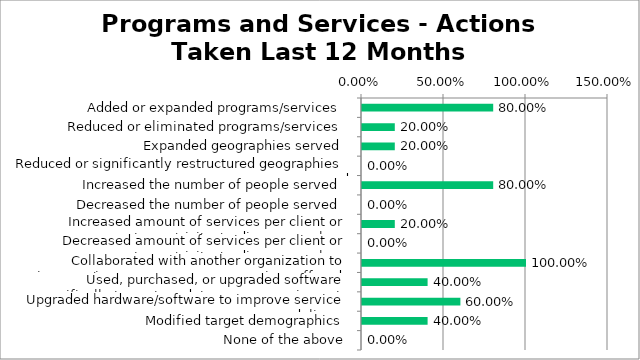
| Category | Responses |
|---|---|
| Added or expanded programs/services | 0.8 |
| Reduced or eliminated programs/services | 0.2 |
| Expanded geographies served | 0.2 |
| Reduced or significantly restructured geographies served | 0 |
| Increased the number of people served | 0.8 |
| Decreased the number of people served | 0 |
| Increased amount of services per client or program per customer/visitor/audience member | 0.2 |
| Decreased amount of services per client or program per customer/visitor/audience member | 0 |
| Collaborated with another organization to improve/increase programs or services offered | 1 |
| Used, purchased, or upgraded software specifically to capture data on program impact | 0.4 |
| Upgraded hardware/software to improve service or program delivery | 0.6 |
| Modified target demographics | 0.4 |
| None of the above | 0 |